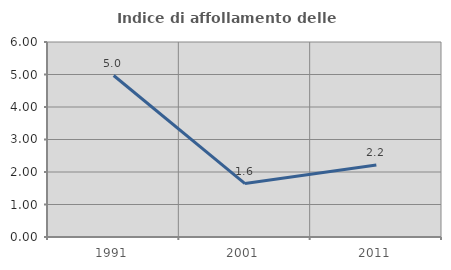
| Category | Indice di affollamento delle abitazioni  |
|---|---|
| 1991.0 | 4.969 |
| 2001.0 | 1.645 |
| 2011.0 | 2.218 |